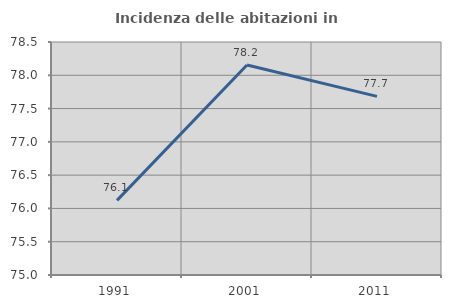
| Category | Incidenza delle abitazioni in proprietà  |
|---|---|
| 1991.0 | 76.121 |
| 2001.0 | 78.154 |
| 2011.0 | 77.684 |